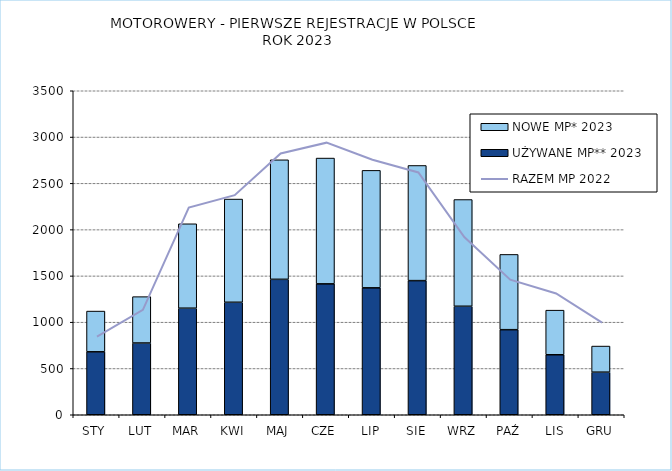
| Category | UŻYWANE MP** 2023 | NOWE MP* 2023 |
|---|---|---|
| STY | 680 | 440 |
| LUT | 775 | 501 |
| MAR | 1151 | 912 |
| KWI | 1215 | 1115 |
| MAJ | 1463 | 1291 |
| CZE | 1414 | 1359 |
| LIP | 1371 | 1269 |
| SIE | 1449 | 1244 |
| WRZ | 1172 | 1153 |
| PAŹ | 919 | 813 |
| LIS | 648 | 482 |
| GRU | 460 | 282 |